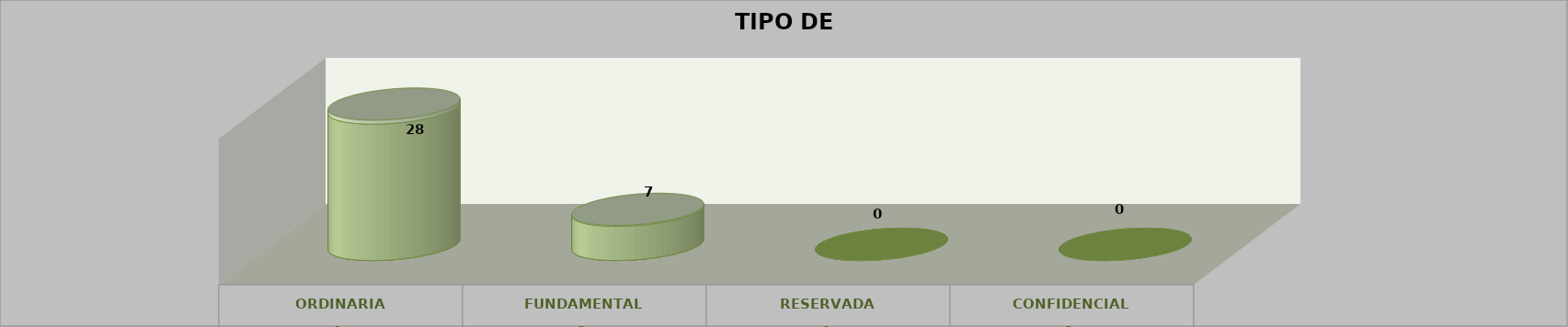
| Category | Series 0 | Series 2 | Series 1 | Series 3 | Series 4 |
|---|---|---|---|---|---|
| 0 |  |  |  | 28 | 0.8 |
| 1 |  |  |  | 7 | 0.2 |
| 2 |  |  |  | 0 | 0 |
| 3 |  |  |  | 0 | 0 |